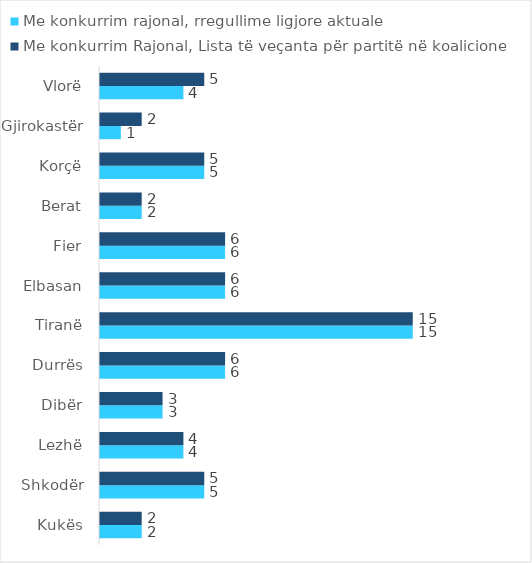
| Category | Me konkurrim rajonal, rregullime ligjore aktuale | Me konkurrim Rajonal, Lista të veçanta për partitë në koalicione |
|---|---|---|
| Kukës | 2 | 2 |
| Shkodër | 5 | 5 |
| Lezhë | 4 | 4 |
| Dibër | 3 | 3 |
| Durrës | 6 | 6 |
| Tiranë | 15 | 15 |
| Elbasan | 6 | 6 |
| Fier | 6 | 6 |
| Berat | 2 | 2 |
| Korçë | 5 | 5 |
| Gjirokastër | 1 | 2 |
| Vlorë | 4 | 5 |